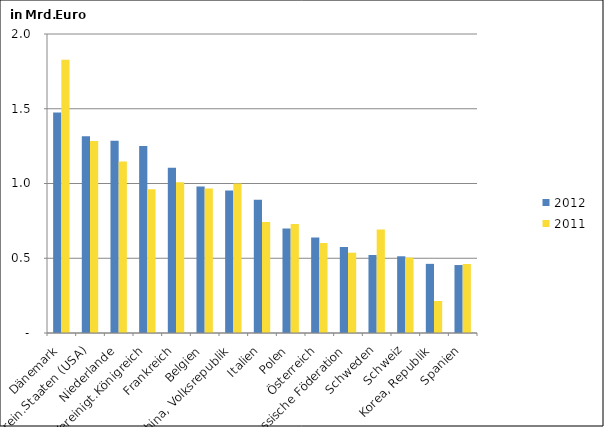
| Category | 2012 | 2011 |
|---|---|---|
| Dänemark | 1.475 | 1.828 |
| Verein.Staaten (USA) | 1.317 | 1.284 |
| Niederlande | 1.286 | 1.147 |
| Vereinigt.Königreich | 1.25 | 0.961 |
| Frankreich | 1.105 | 1.009 |
| Belgien | 0.981 | 0.967 |
| China, Volksrepublik | 0.953 | 1.001 |
| Italien | 0.892 | 0.743 |
| Polen | 0.699 | 0.73 |
| Österreich | 0.638 | 0.602 |
| Russische Föderation | 0.575 | 0.537 |
| Schweden | 0.522 | 0.692 |
| Schweiz | 0.513 | 0.504 |
| Korea, Republik | 0.462 | 0.214 |
| Spanien | 0.455 | 0.462 |